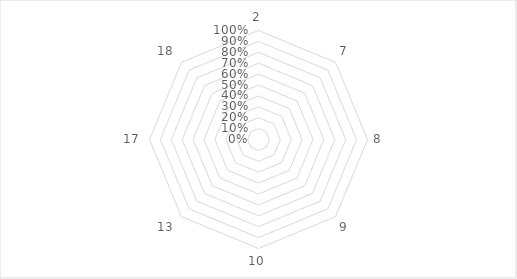
| Category | Series 0 |
|---|---|
| 2.0 | 0 |
| 7.0 | 0 |
| 8.0 | 0 |
| 9.0 | 0 |
| 10.0 | 0 |
| 13.0 | 0 |
| 17.0 | 0 |
| 18.0 | 0 |